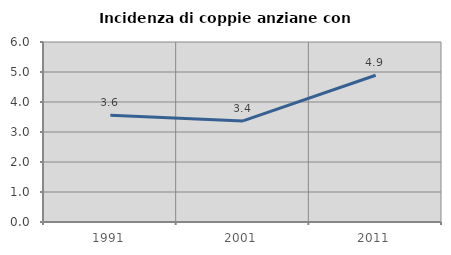
| Category | Incidenza di coppie anziane con figli |
|---|---|
| 1991.0 | 3.559 |
| 2001.0 | 3.369 |
| 2011.0 | 4.891 |